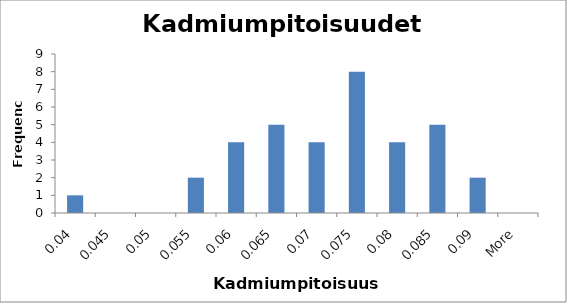
| Category | Frequency |
|---|---|
| 0.04 | 1 |
| 0.045 | 0 |
| 0.05 | 0 |
| 0.055 | 2 |
| 0.06 | 4 |
| 0.065 | 5 |
| 0.07 | 4 |
| 0.075 | 8 |
| 0.08 | 4 |
| 0.085 | 5 |
| 0.09 | 2 |
| More | 0 |